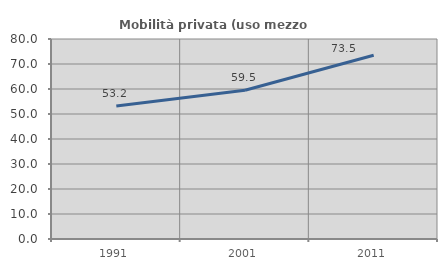
| Category | Mobilità privata (uso mezzo privato) |
|---|---|
| 1991.0 | 53.209 |
| 2001.0 | 59.501 |
| 2011.0 | 73.49 |